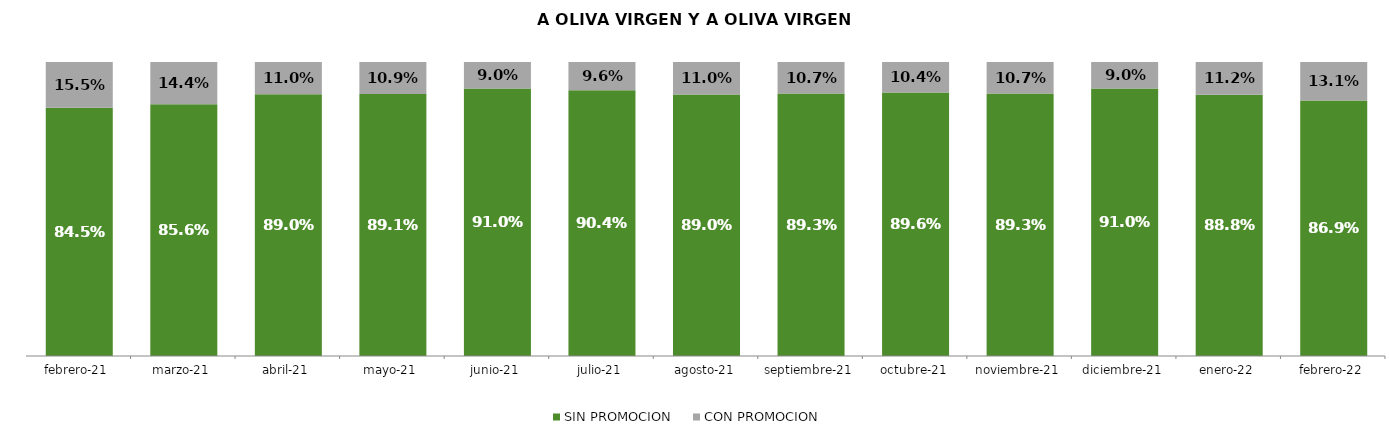
| Category | SIN PROMOCION   | CON PROMOCION   |
|---|---|---|
| 2021-02-01 | 0.845 | 0.155 |
| 2021-03-01 | 0.856 | 0.144 |
| 2021-04-01 | 0.89 | 0.11 |
| 2021-05-01 | 0.891 | 0.109 |
| 2021-06-01 | 0.91 | 0.09 |
| 2021-07-01 | 0.904 | 0.096 |
| 2021-08-01 | 0.89 | 0.11 |
| 2021-09-01 | 0.893 | 0.107 |
| 2021-10-01 | 0.896 | 0.104 |
| 2021-11-01 | 0.893 | 0.107 |
| 2021-12-01 | 0.91 | 0.09 |
| 2022-01-01 | 0.888 | 0.112 |
| 2022-02-01 | 0.869 | 0.131 |